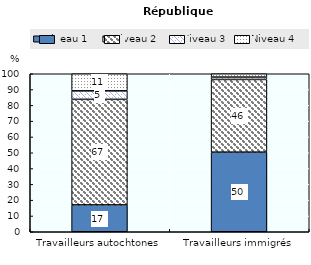
| Category | Niveau 1  | Niveau 2  | Niveau 3  | Niveau 4  |
|---|---|---|---|---|
| Travailleurs autochtones | 17 | 66.8 | 5.4 | 10.9 |
| Travailleurs immigrés | 50.4 | 46 | 1.5 | 2.1 |